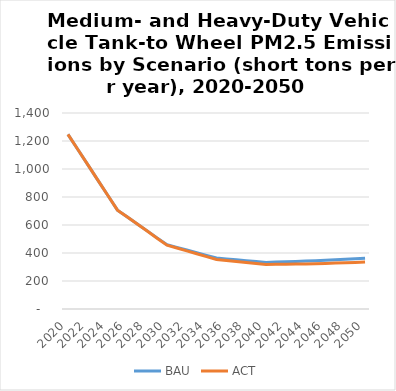
| Category | BAU | ACT |
|---|---|---|
| 2020.0 | 1247 | 1247 |
| 2021.0 | 1139 | 1139 |
| 2022.0 | 1031 | 1031 |
| 2023.0 | 922 | 922 |
| 2024.0 | 814 | 814 |
| 2025.0 | 706 | 706 |
| 2026.0 | 657 | 657 |
| 2027.0 | 607 | 607 |
| 2028.0 | 558 | 557 |
| 2029.0 | 508 | 506 |
| 2030.0 | 459 | 456 |
| 2031.0 | 440 | 436 |
| 2032.0 | 421 | 415 |
| 2033.0 | 402 | 395 |
| 2034.0 | 383 | 374 |
| 2035.0 | 364 | 354 |
| 2036.0 | 358 | 347 |
| 2037.0 | 352 | 340 |
| 2038.0 | 345 | 332 |
| 2039.0 | 339 | 325 |
| 2040.0 | 333 | 318 |
| 2041.0 | 335 | 319 |
| 2042.0 | 338 | 320 |
| 2043.0 | 340 | 321 |
| 2044.0 | 343 | 322 |
| 2045.0 | 345 | 323 |
| 2046.0 | 348 | 325 |
| 2047.0 | 352 | 328 |
| 2048.0 | 355 | 330 |
| 2049.0 | 359 | 333 |
| 2050.0 | 362 | 335 |